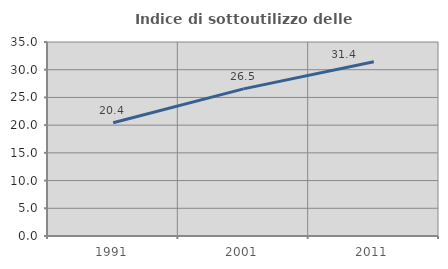
| Category | Indice di sottoutilizzo delle abitazioni  |
|---|---|
| 1991.0 | 20.436 |
| 2001.0 | 26.545 |
| 2011.0 | 31.442 |